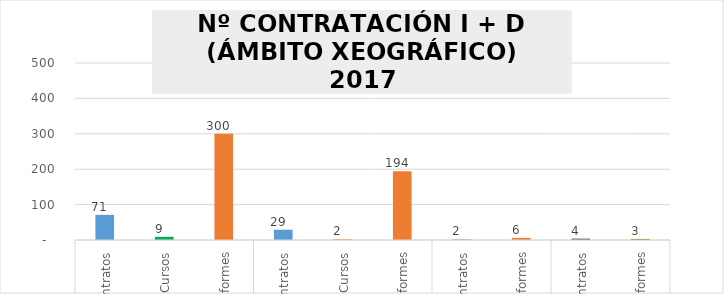
| Category | Series 0 |
|---|---|
| 0 | 71 |
| 1 | 9 |
| 2 | 300 |
| 3 | 29 |
| 4 | 2 |
| 5 | 194 |
| 6 | 2 |
| 7 | 6 |
| 8 | 4 |
| 9 | 3 |